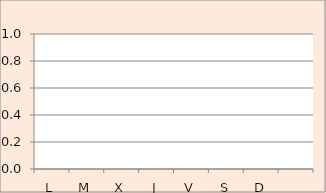
| Category | Series 0 |
|---|---|
| L | 0 |
| M | 0 |
| X | 0 |
| J | 0 |
| V | 0 |
| S | 0 |
| D | 0 |